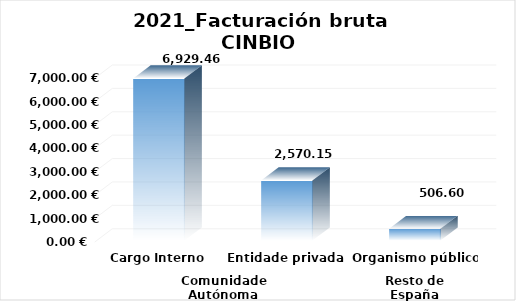
| Category | Series 0 |
|---|---|
| 0 | 6929.46 |
| 1 | 2570.149 |
| 2 | 506.603 |